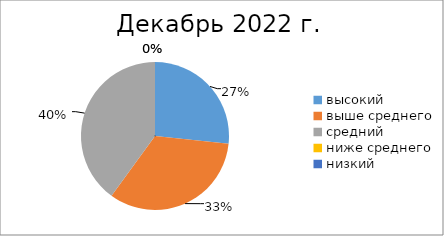
| Category | Series 0 |
|---|---|
| высокий | 4 |
| выше среднего | 5 |
| средний | 6 |
| ниже среднего | 0 |
| низкий | 0 |